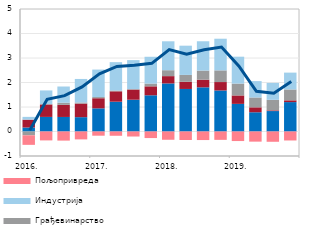
| Category | Остале делатности | Трговина | Грађевинарство | Индустрија | Пољопривреда |
|---|---|---|---|---|---|
| 2016. | 0.163 | 0.321 | -0.156 | 0.113 | -0.39 |
| II | 0.595 | 0.508 | 0.015 | 0.558 | -0.363 |
| III | 0.594 | 0.494 | 0.088 | 0.66 | -0.372 |
| IV | 0.585 | 0.553 | 0.046 | 0.96 | -0.322 |
| 2017. | 0.945 | 0.413 | 0.049 | 1.121 | -0.172 |
| II | 1.216 | 0.424 | 0.032 | 1.158 | -0.174 |
| III | 1.297 | 0.414 | 0.02 | 1.182 | -0.205 |
| IV | 1.478 | 0.366 | 0.113 | 1.094 | -0.268 |
| 2018. | 1.962 | 0.298 | 0.242 | 1.18 | -0.338 |
| II | 1.736 | 0.292 | 0.281 | 1.193 | -0.346 |
| III | 1.803 | 0.311 | 0.372 | 1.197 | -0.349 |
| IV | 1.675 | 0.344 | 0.476 | 1.293 | -0.341 |
| 2019. | 1.127 | 0.345 | 0.485 | 1.097 | -0.39 |
| II | 0.785 | 0.202 | 0.402 | 0.668 | -0.414 |
| III | 0.834 | 0.029 | 0.43 | 0.691 | -0.42 |
| IV | 1.2 | 0.072 | 0.444 | 0.687 | -0.366 |